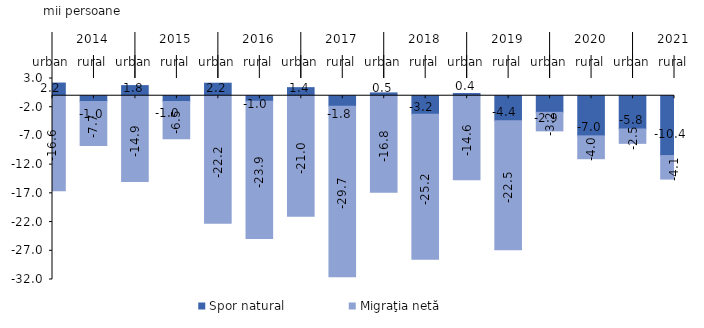
| Category | Spor natural | Migraţia netă  |
|---|---|---|
| 0 | 2.21 | -16.559 |
| 1 | -1.023 | -7.665 |
| 2 | 1.762 | -14.949 |
| 3 | -1.015 | -6.494 |
| 4 | 2.181 | -22.215 |
| 5 | -0.953 | -23.887 |
| 6 | 1.407 | -20.978 |
| 7 | -1.823 | -29.701 |
| 8 | 0.492 | -16.807 |
| 9 | -3.218 | -25.242 |
| 10 | 0.38 | -14.639 |
| 11 | -4.368 | -22.454 |
| 12 | -2.892 | -3.229 |
| 13 | -6.991 | -3.976 |
| 14 | -5.791 | -2.5 |
| 15 | -10.416 | -4.1 |